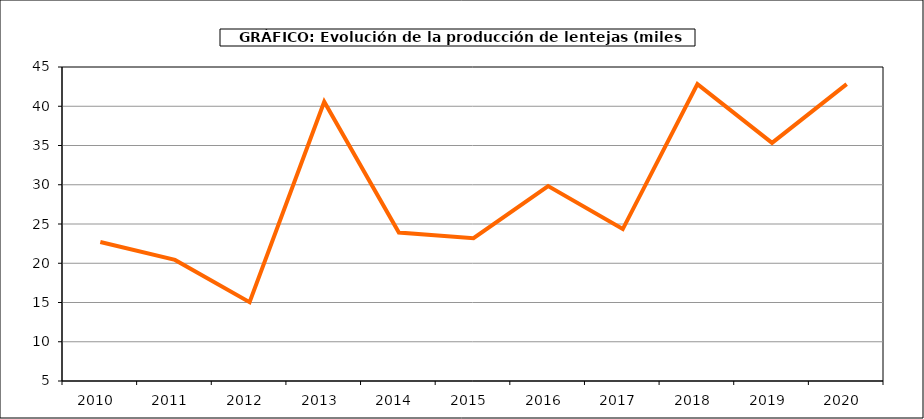
| Category | Producción |
|---|---|
| 2010.0 | 22.715 |
| 2011.0 | 20.426 |
| 2012.0 | 15.046 |
| 2013.0 | 40.57 |
| 2014.0 | 23.905 |
| 2015.0 | 23.193 |
| 2016.0 | 29.827 |
| 2017.0 | 24.357 |
| 2018.0 | 42.827 |
| 2019.0 | 35.333 |
| 2020.0 | 42.823 |